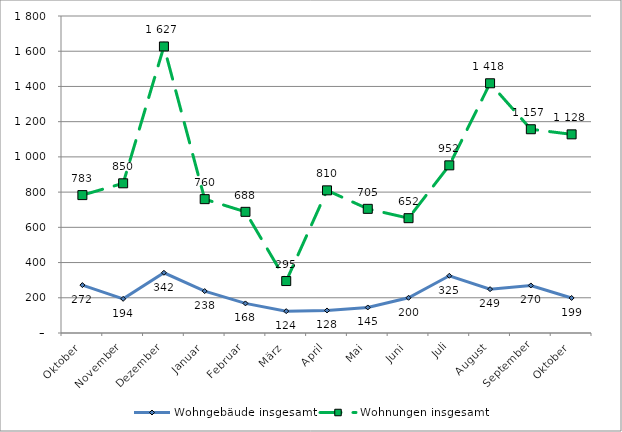
| Category | Wohngebäude insgesamt | Wohnungen insgesamt |
|---|---|---|
| Oktober | 272 | 783 |
| November | 194 | 850 |
| Dezember | 342 | 1627 |
| Januar | 238 | 760 |
| Februar | 168 | 688 |
| März | 124 | 295 |
| April | 128 | 810 |
| Mai | 145 | 705 |
| Juni | 200 | 652 |
| Juli | 325 | 952 |
| August | 249 | 1418 |
| September | 270 | 1157 |
| Oktober | 199 | 1128 |